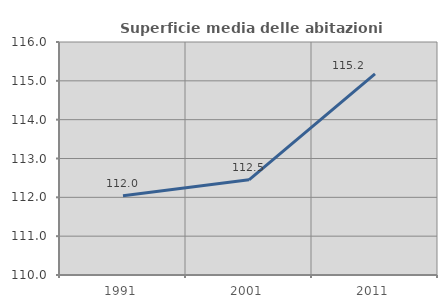
| Category | Superficie media delle abitazioni occupate |
|---|---|
| 1991.0 | 112.042 |
| 2001.0 | 112.451 |
| 2011.0 | 115.177 |